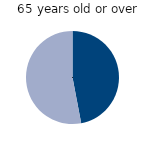
| Category | 65 years old or over |
|---|---|
| Full time | 47 |
| Part time | 53 |